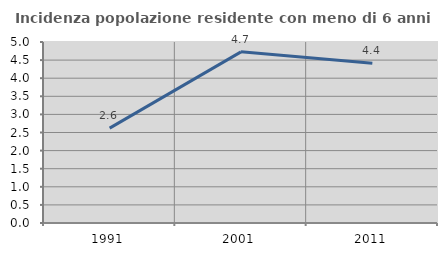
| Category | Incidenza popolazione residente con meno di 6 anni |
|---|---|
| 1991.0 | 2.621 |
| 2001.0 | 4.728 |
| 2011.0 | 4.414 |